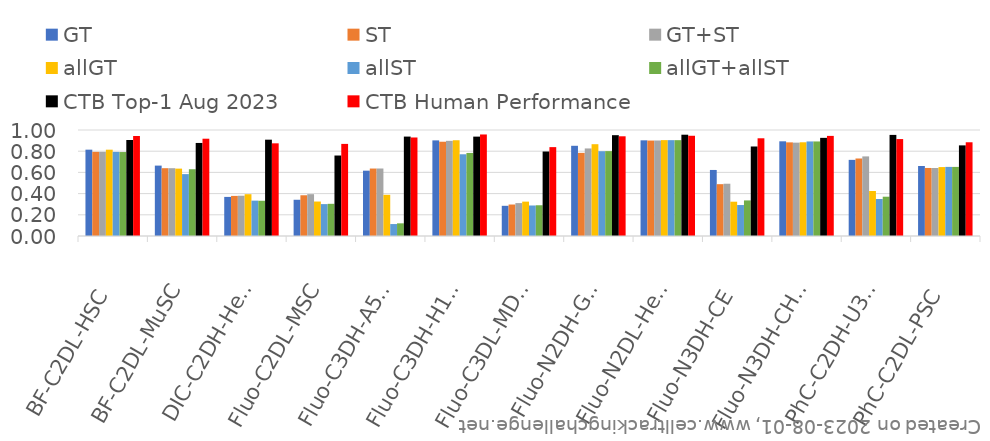
| Category | GT | ST | GT+ST | allGT | allST | allGT+allST | CTB Top-1 Aug 2023 | CTB Human Performance |
|---|---|---|---|---|---|---|---|---|
| BF-C2DL-HSC | 0.814 | 0.794 | 0.794 | 0.814 | 0.793 | 0.792 | 0.906 | 0.944 |
| BF-C2DL-MuSC | 0.664 | 0.64 | 0.64 | 0.636 | 0.584 | 0.63 | 0.878 | 0.918 |
| DIC-C2DH-HeLa | 0.369 | 0.378 | 0.38 | 0.394 | 0.334 | 0.332 | 0.909 | 0.874 |
| Fluo-C2DL-MSC | 0.342 | 0.384 | 0.395 | 0.325 | 0.301 | 0.304 | 0.759 | 0.869 |
| Fluo-C3DH-A549 | 0.616 | 0.636 | 0.637 | 0.389 | 0.113 | 0.12 | 0.938 | 0.929 |
| Fluo-C3DH-H157 | 0.902 | 0.889 | 0.898 | 0.903 | 0.771 | 0.784 | 0.938 | 0.958 |
| Fluo-C3DL-MDA231 | 0.285 | 0.297 | 0.31 | 0.324 | 0.288 | 0.29 | 0.797 | 0.838 |
| Fluo-N2DH-GOWT1 | 0.851 | 0.784 | 0.826 | 0.866 | 0.8 | 0.801 | 0.951 | 0.941 |
| Fluo-N2DL-HeLa | 0.903 | 0.9 | 0.901 | 0.905 | 0.904 | 0.904 | 0.956 | 0.946 |
| Fluo-N3DH-CE | 0.623 | 0.489 | 0.493 | 0.324 | 0.292 | 0.336 | 0.844 | 0.922 |
| Fluo-N3DH-CHO | 0.893 | 0.883 | 0.881 | 0.884 | 0.892 | 0.892 | 0.926 | 0.944 |
| PhC-C2DH-U373 | 0.718 | 0.731 | 0.751 | 0.425 | 0.349 | 0.371 | 0.954 | 0.914 |
| PhC-C2DL-PSC | 0.661 | 0.642 | 0.642 | 0.65 | 0.652 | 0.652 | 0.855 | 0.884 |